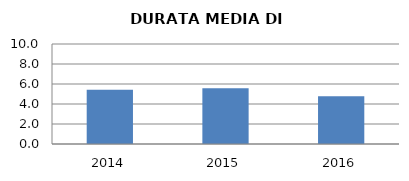
| Category | 2014 2015 2016 |
|---|---|
| 2014.0 | 5.434 |
| 2015.0 | 5.587 |
| 2016.0 | 4.769 |